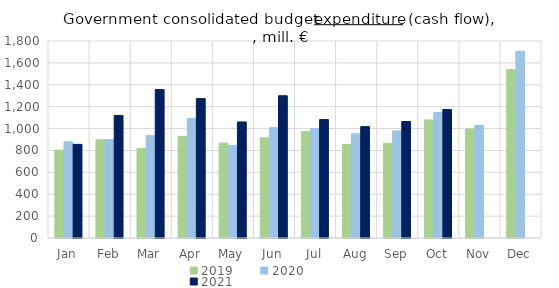
| Category | 2019 | 2020 | 2021 |
|---|---|---|---|
| Jan | 802049.351 | 878360.095 | 855571.821 |
| Feb | 897615.197 | 900276.14 | 1120070.85 |
| Mar | 816941.697 | 935266.915 | 1355758.12 |
| Apr | 928600.159 | 1090965.926 | 1273663.147 |
| May | 867472.729 | 845625.072 | 1060453.286 |
| Jun | 915068.867 | 1007637.852 | 1299852.065 |
| Jul | 972332.681 | 999723.1 | 1081981.296 |
| Aug | 854934.403 | 951921.221 | 1017502.093 |
| Sep | 864576.594 | 978775.82 | 1064391.019 |
| Oct | 1078898.539 | 1146014.897 | 1173896.626 |
| Nov | 994988.205 | 1028398.84 | 0 |
| Dec | 1538492.902 | 1706433.895 | 0 |